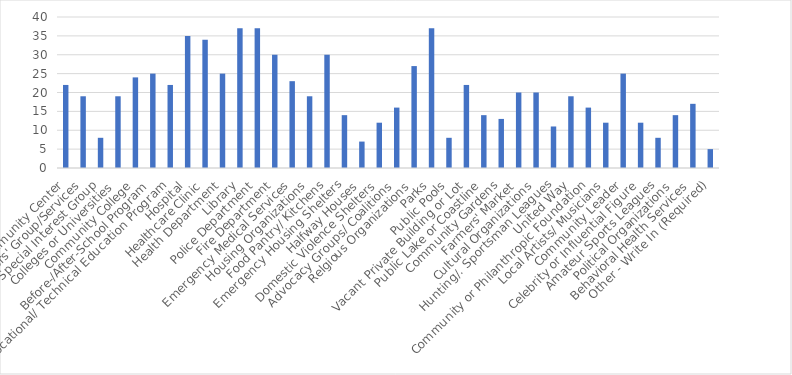
| Category | Number of Responses |
|---|---|
| Community Center | 22 |
| Seniors' Group/Services | 19 |
| Special Interest Group | 8 |
| Colleges or Universities | 19 |
| Community College | 24 |
| Before-/After-School Program | 25 |
| Vocational/ Technical Education Program | 22 |
| Hospital | 35 |
| Healthcare Clinic | 34 |
| Health Department | 25 |
| Library | 37 |
| Police Department | 37 |
| Fire Department | 30 |
| Emergency Medical Services | 23 |
| Housing Organizations | 19 |
| Food Pantry/ Kitchens | 30 |
| Emergency Housing Shelters | 14 |
| Halfway Houses | 7 |
| Domestic Violence Shelters | 12 |
| Advocacy Groups/ Coalitions | 16 |
| Relgious Organizations | 27 |
| Parks | 37 |
| Public Pools | 8 |
| Vacant Private Building or Lot | 22 |
| Public Lake or Coastline | 14 |
| Community Gardens | 13 |
| Farmers' Market | 20 |
| Cultural Organizations | 20 |
| Hunting/. Sportsman Leagues | 11 |
| United Way | 19 |
| Community or Philanthropic Foundation | 16 |
| Local Artists/ Musicians | 12 |
| Community Leader | 25 |
| Celebrity or Influential Figure | 12 |
| Amateur Sports Leagues | 8 |
| Political Organizations | 14 |
| Behavioral Health Services | 17 |
| Other - Write In (Required) | 5 |